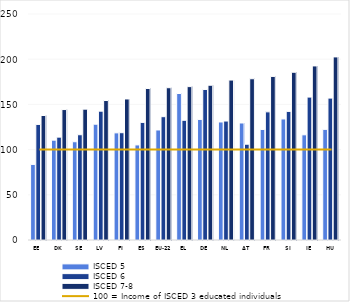
| Category | ISCED 5 | ISCED 6 | ISCED 7-8 |
|---|---|---|---|
| EE | 83.595 | 127.849 | 137.717 |
| DK | 110.431 | 113.798 | 144.298 |
| SE | 108.684 | 116.444 | 144.773 |
| LV | 128.089 | 142.538 | 154.29 |
| FI | 118.516 | 118.684 | 156.014 |
| ES | 105.169 | 130.079 | 167.622 |
| EU-22 | 121.709 | 136.413 | 168.445 |
| EL | 162.05 | 132.421 | 169.669 |
| DE | 133.354 | 166.506 | 171.194 |
| NL | 130.549 | 131.607 | 176.929 |
| AT | 129.441 | 105.96 | 178.389 |
| FR | 122.262 | 141.761 | 180.953 |
| SI | 133.895 | 142.284 | 185.564 |
| IE | 116.341 | 158.053 | 192.56 |
| HU | 122.385 | 156.956 | 202.53 |